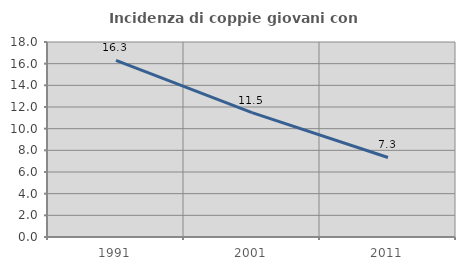
| Category | Incidenza di coppie giovani con figli |
|---|---|
| 1991.0 | 16.299 |
| 2001.0 | 11.48 |
| 2011.0 | 7.342 |